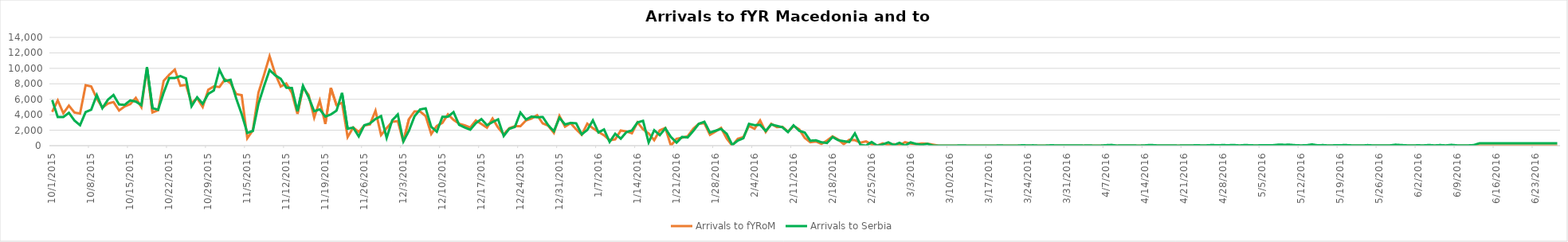
| Category | Arrivals to fYRoM | Arrivals to Serbia |
|---|---|---|
| 10/1/15 | 4370 | 5900 |
| 10/2/15 | 5853 | 3700 |
| 10/3/15 | 4202 | 3700 |
| 10/4/15 | 5181 | 4250 |
| 10/5/15 | 4282 | 3250 |
| 10/6/15 | 4156 | 2650 |
| 10/7/15 | 7816 | 4350 |
| 10/8/15 | 7663 | 4650 |
| 10/9/15 | 6107 | 6550 |
| 10/10/15 | 4922 | 4850 |
| 10/11/15 | 5448 | 5950 |
| 10/12/15 | 5645 | 6556 |
| 10/13/15 | 4551 | 5330 |
| 10/14/15 | 5073 | 5280 |
| 10/15/15 | 5373 | 5850 |
| 10/16/15 | 6181 | 5700 |
| 10/17/15 | 4988 | 5250 |
| 10/18/15 | 10005 | 10150 |
| 10/19/15 | 4299 | 4850 |
| 10/20/15 | 4584 | 4650 |
| 10/21/15 | 8384 | 6850 |
| 10/22/15 | 9174 | 8750 |
| 10/23/15 | 9840 | 8750 |
| 10/24/15 | 7752 | 9000 |
| 10/25/15 | 7864 | 8700 |
| 10/26/15 | 5500 | 5100 |
| 10/27/15 | 6146 | 6257 |
| 10/28/15 | 5000 | 5415 |
| 10/29/15 | 7231 | 6700 |
| 10/30/15 | 7663 | 7138 |
| 10/31/15 | 7590 | 9834 |
| 11/1/15 | 8584 | 8354 |
| 11/2/15 | 8075 | 8521 |
| 11/3/15 | 6682 | 6129 |
| 11/4/15 | 6532 | 4073 |
| 11/5/15 | 960 | 1652 |
| 11/6/15 | 1987 | 1906 |
| 11/7/15 | 6847 | 5397 |
| 11/8/15 | 9148 | 7695 |
| 11/9/15 | 11572 | 9785 |
| 11/10/15 | 9305 | 9107 |
| 11/11/15 | 7651 | 8648 |
| 11/12/15 | 8038 | 7500 |
| 11/13/15 | 6826 | 7464 |
| 11/14/15 | 4107 | 4453 |
| 11/15/15 | 7511 | 7734 |
| 11/16/15 | 6557 | 6267 |
| 11/17/15 | 3621 | 4460 |
| 11/18/15 | 5831 | 4694 |
| 11/19/15 | 2816 | 3765 |
| 11/20/15 | 7453 | 4042 |
| 11/21/15 | 5255 | 4527 |
| 11/22/15 | 5539 | 6826 |
| 11/23/15 | 1113 | 2201 |
| 11/24/15 | 2347 | 2335 |
| 11/25/15 | 1779 | 1194 |
| 11/26/15 | 2617 | 2636 |
| 11/27/15 | 2744 | 2878 |
| 11/28/15 | 4520 | 3454 |
| 11/29/15 | 1373 | 3825 |
| 11/30/15 | 2270 | 1009 |
| 12/1/15 | 3094 | 3284 |
| 12/2/15 | 3174 | 4040 |
| 12/3/15 | 494 | 553 |
| 12/4/15 | 3436 | 1927 |
| 12/5/15 | 4430 | 3799 |
| 12/6/15 | 4425 | 4686 |
| 12/7/15 | 3826 | 4823 |
| 12/8/15 | 1508 | 2437 |
| 12/9/15 | 2550 | 1807 |
| 12/10/15 | 2956 | 3723 |
| 12/11/15 | 4047 | 3747 |
| 12/12/15 | 3338 | 4339 |
| 12/13/15 | 2849 | 2698 |
| 12/14/15 | 2644 | 2353 |
| 12/15/15 | 2349 | 2067 |
| 12/16/15 | 3264 | 2916 |
| 12/17/15 | 2801 | 3438 |
| 12/18/15 | 2332 | 2649 |
| 12/19/15 | 3515 | 3052 |
| 12/20/15 | 2338 | 3405 |
| 12/21/15 | 1470 | 1253 |
| 12/22/15 | 2272 | 2186 |
| 12/23/15 | 2529 | 2415 |
| 12/24/15 | 2529 | 4279 |
| 12/25/15 | 3268 | 3390 |
| 12/26/15 | 3521 | 3757 |
| 12/27/15 | 3938 | 3674 |
| 12/28/15 | 2884 | 3708 |
| 12/29/15 | 2577 | 2629 |
| 12/30/15 | 1665 | 1879 |
| 12/31/15 | 3848 | 3602 |
| 1/1/16 | 2454 | 2745 |
| 1/2/16 | 2918 | 2947 |
| 1/3/16 | 2112 | 2889 |
| 1/4/16 | 1415 | 1462 |
| 1/5/16 | 2842 | 2041 |
| 1/6/16 | 2258 | 3273 |
| 1/7/16 | 1776 | 1715 |
| 1/8/16 | 1344 | 2100 |
| 1/9/16 | 715 | 489 |
| 1/10/16 | 819 | 1538 |
| 1/11/16 | 1959 | 905 |
| 1/12/16 | 1840 | 1743 |
| 1/13/16 | 1600 | 1973 |
| 1/14/16 | 3022 | 3006 |
| 1/15/16 | 2119 | 3213 |
| 1/16/16 | 1598 | 415 |
| 1/17/16 | 720 | 1995 |
| 1/18/16 | 1980 | 1362 |
| 1/19/16 | 2298 | 2244 |
| 1/20/16 | 0 | 1113 |
| 1/21/16 | 892 | 397 |
| 1/22/16 | 1030 | 1134 |
| 1/23/16 | 1208 | 1064 |
| 1/24/16 | 2174 | 1895 |
| 1/25/16 | 2836 | 2827 |
| 1/26/16 | 2908 | 3091 |
| 1/27/16 | 1402 | 1695 |
| 1/28/16 | 1837 | 1940 |
| 1/29/16 | 2292 | 2167 |
| 1/30/16 | 931 | 1540 |
| 1/31/16 | 0 | 103 |
| 2/1/16 | 908 | 660 |
| 2/2/16 | 1121 | 966 |
| 2/3/16 | 2558 | 2825 |
| 2/4/16 | 2173 | 2653 |
| 2/5/16 | 3259 | 2694 |
| 2/6/16 | 1780 | 1901 |
| 2/7/16 | 2838 | 2739 |
| 2/8/16 | 2392 | 2563 |
| 2/9/16 | 2441 | 2379 |
| 2/10/16 | 1817 | 1758 |
| 2/11/16 | 2540 | 2636 |
| 2/12/16 | 2115 | 1923 |
| 2/13/16 | 1019 | 1699 |
| 2/14/16 | 452 | 641 |
| 2/15/16 | 542 | 691 |
| 2/16/16 | 234 | 443 |
| 2/17/16 | 668 | 345 |
| 2/18/16 | 1200 | 1117 |
| 2/19/16 | 799 | 713 |
| 2/20/16 | 209 | 580 |
| 2/21/16 | 774 | 476 |
| 2/22/16 | 714 | 1595 |
| 2/23/16 | 382 | 106 |
| 2/24/16 | 551 | 1 |
| 2/25/16 | 168 | 475 |
| 2/26/16 | 20 | 0 |
| 2/27/16 | 310 | 158 |
| 2/28/16 | 92 | 431 |
| 2/29/16 | 208 | 69 |
| 3/1/16 | 30 | 372 |
| 3/2/16 | 457 | 16 |
| 3/3/16 | 269 | 428 |
| 3/4/16 | 177 | 218 |
| 3/5/16 | 293 | 115 |
| 3/6/16 | 261 | 236 |
| 3/7/16 | 127 | 14 |
| 3/8/16 | 0 | 0 |
| 3/9/16 | 0 | 3 |
| 3/10/16 | 0 | 0 |
| 3/11/16 | 0 | 0 |
| 3/12/16 | 0 | 35 |
| 3/13/16 | 0 | 12 |
| 3/14/16 | 0 | 0 |
| 3/15/16 | 0 | 0 |
| 3/16/16 | 0 | 0 |
| 3/17/16 | 0 | 0 |
| 3/18/16 | 0 | 0 |
| 3/19/16 | 0 | 30 |
| 3/20/16 | 0 | 0 |
| 3/21/16 | 0 | 0 |
| 3/22/16 | 0 | 0 |
| 3/23/16 | 0 | 49 |
| 3/24/16 | 0 | 31 |
| 3/25/16 | 0 | 40 |
| 3/26/16 | 0 | 0 |
| 3/27/16 | 0 | 4 |
| 3/28/16 | 0 | 42 |
| 3/29/16 | 0 | 37 |
| 3/30/16 | 0 | 21 |
| 3/31/16 | 0 | 14 |
| 4/1/16 | 0 | 28 |
| 4/2/16 | 0 | 32 |
| 4/3/16 | 0 | 10 |
| 4/4/16 | 0 | 28 |
| 4/5/16 | 0 | 0 |
| 4/6/16 | 0 | 4 |
| 4/7/16 | 0 | 58 |
| 4/8/16 | 0 | 93 |
| 4/9/16 | 0 | 8 |
| 4/10/16 | 0 | 30 |
| 4/11/16 | 0 | 34 |
| 4/12/16 | 0 | 22 |
| 4/13/16 | 0 | 3 |
| 4/14/16 | 0 | 34 |
| 4/15/16 | 0 | 90 |
| 4/16/16 | 0 | 41 |
| 4/17/16 | 0 | 15 |
| 4/18/16 | 0 | 17 |
| 4/19/16 | 0 | 34 |
| 4/20/16 | 0 | 5 |
| 4/21/16 | 0 | 31 |
| 4/22/16 | 0 | 19 |
| 4/23/16 | 0 | 45 |
| 4/24/16 | 0 | 38 |
| 4/25/16 | 0 | 34 |
| 4/26/16 | 0 | 73 |
| 4/27/16 | 0 | 54 |
| 4/28/16 | 0 | 69 |
| 4/29/16 | 0 | 59 |
| 4/30/16 | 0 | 80 |
| 5/1/16 | 0 | 26 |
| 5/2/16 | 0 | 81 |
| 5/3/16 | 0 | 50 |
| 5/4/16 | 0 | 25 |
| 5/5/16 | 0 | 58 |
| 5/6/16 | 0 | 49 |
| 5/7/16 | 0 | 59 |
| 5/8/16 | 0 | 128 |
| 5/9/16 | 0 | 113 |
| 5/10/16 | 0 | 119 |
| 5/11/16 | 0 | 62 |
| 5/12/16 | 0 | 33 |
| 5/13/16 | 0 | 51 |
| 5/14/16 | 0 | 161 |
| 5/15/16 | 0 | 45 |
| 5/16/16 | 0 | 71 |
| 5/17/16 | 0 | 17 |
| 5/18/16 | 0 | 44 |
| 5/19/16 | 0 | 55 |
| 5/20/16 | 0 | 74 |
| 5/21/16 | 0 | 39 |
| 5/22/16 | 0 | 16 |
| 5/23/16 | 0 | 15 |
| 5/24/16 | 0 | 68 |
| 5/25/16 | 0 | 23 |
| 5/26/16 | 0 | 15 |
| 5/27/16 | 0 | 20 |
| 5/28/16 | 0 | 35 |
| 5/29/16 | 0 | 121 |
| 5/30/16 | 0 | 75 |
| 5/31/16 | 0 | 37 |
| 6/1/16 | 0 | 29 |
| 6/2/16 | 0 | 43 |
| 6/3/16 | 0 | 32 |
| 6/4/16 | 0 | 80 |
| 6/5/16 | 0 | 26 |
| 6/6/16 | 0 | 74 |
| 6/7/16 | 0 | 28 |
| 6/8/16 | 0 | 101 |
| 6/9/16 | 0 | 38 |
| 6/10/16 | 0 | 27 |
| 6/11/16 | 0 | 32 |
| 6/12/16 | 0 | 71 |
| 6/13/16 | 0 | 300 |
| 6/14/16 | 0 | 300 |
| 6/15/16 | 0 | 300 |
| 6/16/16 | 0 | 300 |
| 6/17/16 | 0 | 300 |
| 6/18/16 | 0 | 300 |
| 6/19/16 | 0 | 300 |
| 6/20/16 | 0 | 300 |
| 6/21/16 | 0 | 300 |
| 6/22/16 | 0 | 300 |
| 6/23/16 | 0 | 300 |
| 6/24/16 | 0 | 300 |
| 6/25/16 | 0 | 300 |
| 6/26/16 | 0 | 300 |
| 6/27/16 | 0 | 300 |